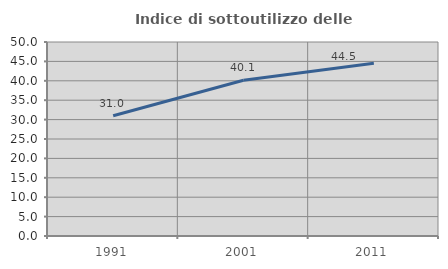
| Category | Indice di sottoutilizzo delle abitazioni  |
|---|---|
| 1991.0 | 30.98 |
| 2001.0 | 40.132 |
| 2011.0 | 44.516 |